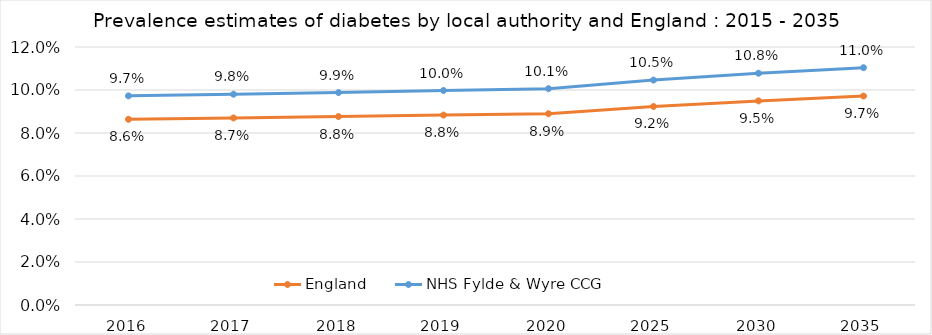
| Category | England | NHS Fylde & Wyre CCG |
|---|---|---|
| 2016.0 | 0.086 | 0.097 |
| 2017.0 | 0.087 | 0.098 |
| 2018.0 | 0.088 | 0.099 |
| 2019.0 | 0.088 | 0.1 |
| 2020.0 | 0.089 | 0.101 |
| 2025.0 | 0.092 | 0.105 |
| 2030.0 | 0.095 | 0.108 |
| 2035.0 | 0.097 | 0.11 |